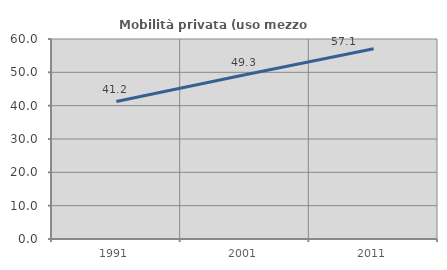
| Category | Mobilità privata (uso mezzo privato) |
|---|---|
| 1991.0 | 41.233 |
| 2001.0 | 49.292 |
| 2011.0 | 57.076 |